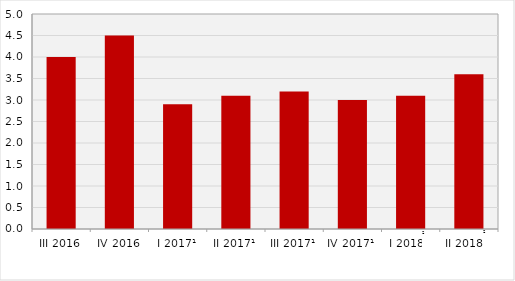
| Category | Стопе реалног раста БДП-а
Real growth rates of GDP |
|---|---|
| III 2016 | 4 |
| IV 2016 | 4.5 |
| I 2017¹ | 2.9 |
| II 2017¹ | 3.1 |
| III 2017¹ | 3.2 |
| IV 2017¹ | 3 |
| I 20182 | 3.1 |
| II 20182 | 3.6 |